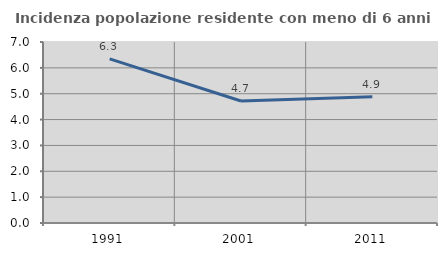
| Category | Incidenza popolazione residente con meno di 6 anni |
|---|---|
| 1991.0 | 6.347 |
| 2001.0 | 4.718 |
| 2011.0 | 4.878 |